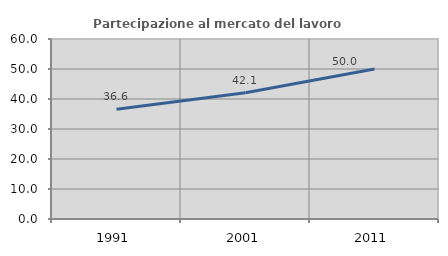
| Category | Partecipazione al mercato del lavoro  femminile |
|---|---|
| 1991.0 | 36.576 |
| 2001.0 | 42.057 |
| 2011.0 | 50.025 |